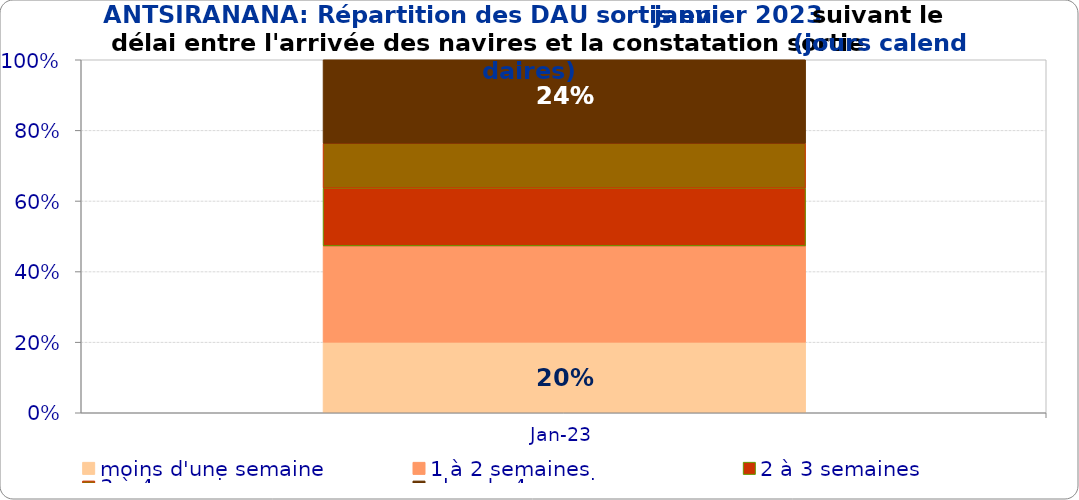
| Category | moins d'une semaine | 1 à 2 semaines | 2 à 3 semaines | 3 à 4 semaines | plus de 4 semaines |
|---|---|---|---|---|---|
| 2023-01-01 | 0.2 | 0.273 | 0.164 | 0.127 | 0.236 |